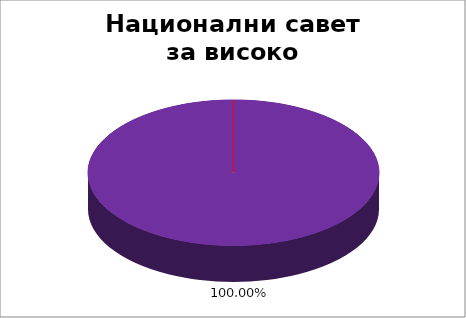
| Category | Национални савет за високо образовање |
|---|---|
| 0 | 0 |
| 1 | 0 |
| 2 | 0 |
| 3 | 0 |
| 4 | 1 |